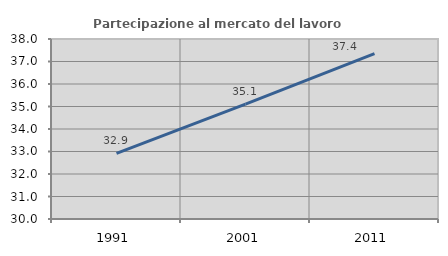
| Category | Partecipazione al mercato del lavoro  femminile |
|---|---|
| 1991.0 | 32.917 |
| 2001.0 | 35.102 |
| 2011.0 | 37.354 |